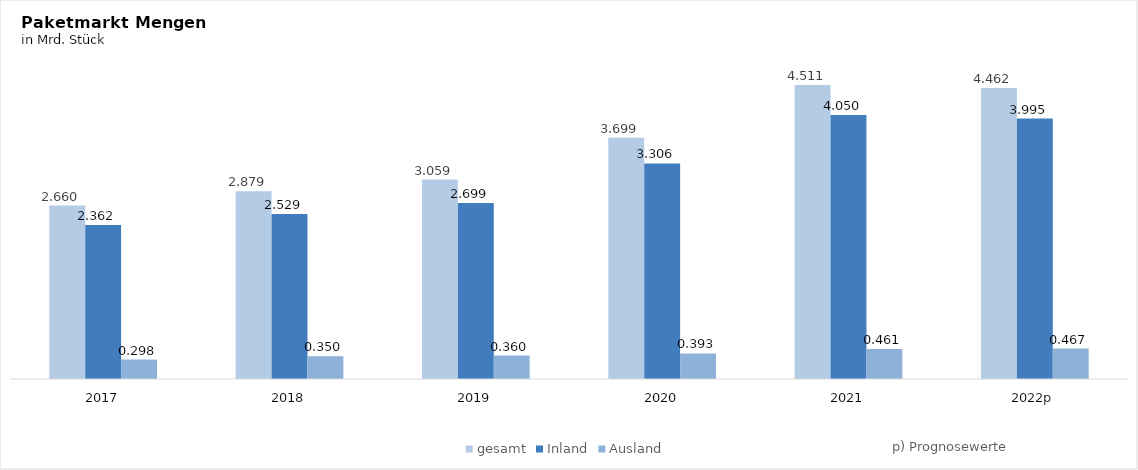
| Category | gesamt | Inland | Ausland  |
|---|---|---|---|
| 2017 | 2.66 | 2.362 | 0.298 |
| 2018 | 2.879 | 2.529 | 0.35 |
| 2019 | 3.059 | 2.699 | 0.36 |
| 2020 | 3.699 | 3.306 | 0.393 |
| 2021 | 4.511 | 4.05 | 0.461 |
| 2022p | 4.462 | 3.995 | 0.467 |